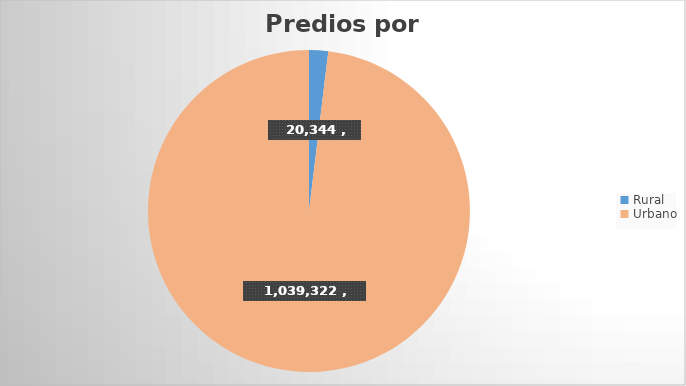
| Category | Predios |
|---|---|
| Rural | 20344 |
| Urbano | 1039322 |